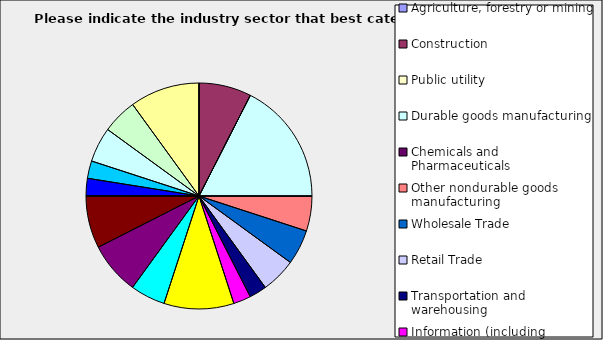
| Category | Series 0 |
|---|---|
| Agriculture, forestry or mining | 0 |
| Construction | 0.075 |
| Public utility | 0 |
| Durable goods manufacturing | 0.175 |
| Chemicals and Pharmaceuticals | 0 |
| Other nondurable goods manufacturing | 0.05 |
| Wholesale Trade | 0.05 |
| Retail Trade | 0.05 |
| Transportation and warehousing | 0.025 |
| Information (including broadcasting and telecommunication) | 0.025 |
| Finance and Insurance | 0.1 |
| Real Estate | 0.05 |
| Professional, scientific and technical services | 0.075 |
| Consulting | 0.075 |
| Administrative and office services (including waste management) | 0 |
| Education | 0.025 |
| Health Care and social services | 0.025 |
| Arts, entertainment and recreation | 0.05 |
| Accommodation and food services | 0.05 |
| Other | 0.1 |